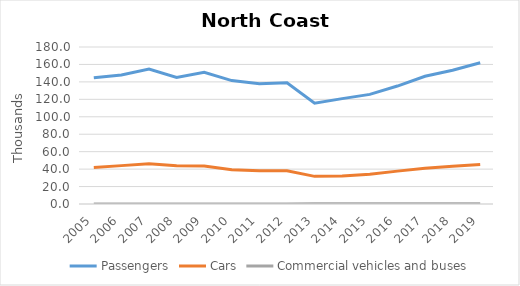
| Category | Passengers | Cars | Commercial vehicles and buses |
|---|---|---|---|
| 2005.0 | 144.7 | 41.9 | 0 |
| 2006.0 | 148 | 44 | 0 |
| 2007.0 | 154.78 | 46.2 | 0 |
| 2008.0 | 145 | 43.9 | 0 |
| 2009.0 | 151 | 43.5 | 0 |
| 2010.0 | 141.5 | 39.4 | 0 |
| 2011.0 | 138 | 38 | 0 |
| 2012.0 | 139 | 38 | 0 |
| 2013.0 | 115.616 | 31.7 | 0.197 |
| 2014.0 | 120.811 | 32.1 | 0.238 |
| 2015.0 | 125.674 | 34.1 | 0.229 |
| 2016.0 | 135.229 | 37.7 | 0.216 |
| 2017.0 | 146.417 | 40.884 | 0.313 |
| 2018.0 | 153.312 | 43.222 | 0.298 |
| 2019.0 | 161.92 | 45.402 | 0.319 |